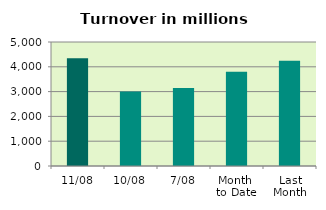
| Category | Series 0 |
|---|---|
| 11/08 | 4346.559 |
| 10/08 | 3002.039 |
| 7/08 | 3148.126 |
| Month 
to Date | 3802.228 |
| Last
Month | 4246.231 |